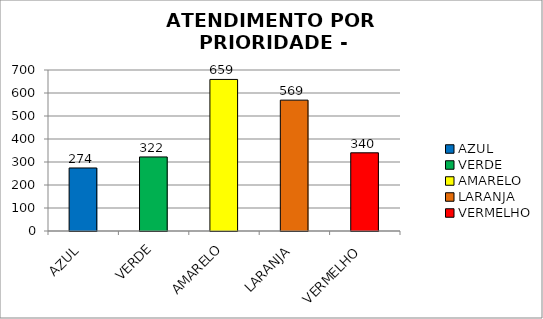
| Category | Total Regional: |
|---|---|
| AZUL | 274 |
| VERDE | 322 |
| AMARELO | 659 |
| LARANJA | 569 |
| VERMELHO | 340 |